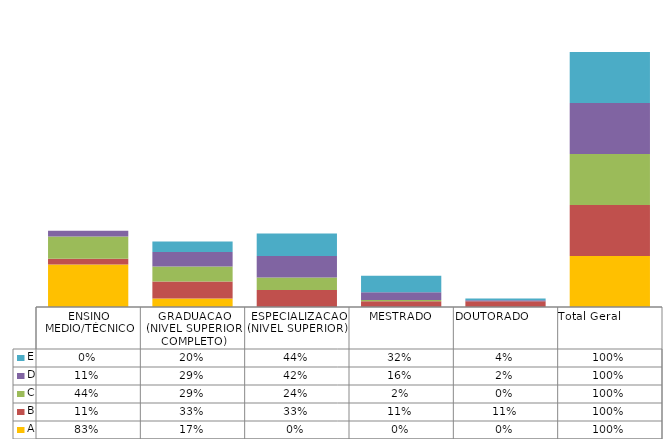
| Category | A | B | C | D | E |
|---|---|---|---|---|---|
| ENSINO MEDIO/TÉCNICO | 0.833 | 0.111 | 0.439 | 0.114 | 0 |
| GRADUACAO (NIVEL SUPERIOR COMPLETO) | 0.167 | 0.333 | 0.293 | 0.288 | 0.203 |
| ESPECIALIZACAO (NIVEL SUPERIOR)  | 0 | 0.333 | 0.244 | 0.423 | 0.441 |
| MESTRADO | 0 | 0.111 | 0.024 | 0.156 | 0.319 |
| DOUTORADO                             | 0 | 0.111 | 0 | 0.019 | 0.038 |
| Total Geral                  | 1 | 1 | 1 | 1 | 1 |